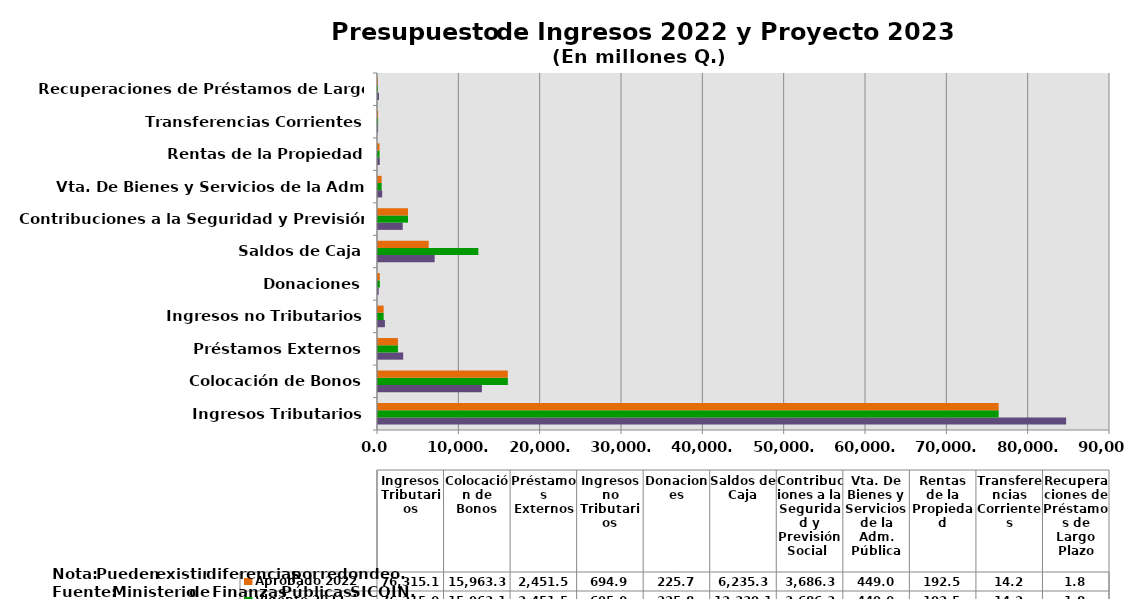
| Category | Recomendado 2023 | Vigente 2022 | Aprobado 2022 |
|---|---|---|---|
| Ingresos Tributarios | 84610.7 | 76315 | 76315.1 |
| Colocación de Bonos | 12775.1 | 15963.1 | 15963.3 |
| Préstamos Externos | 3096.7 | 2451.5 | 2451.5 |
| Ingresos no Tributarios | 850.6 | 695 | 694.9 |
| Donaciones | 83.9 | 225.8 | 225.7 |
| Saldos de Caja | 6965.9 | 12339.1 | 6235.3 |
| Contribuciones a la Seguridad y Previsión Social  | 3043.1 | 3686.3 | 3686.3 |
| Vta. De Bienes y Servicios de la Adm. Pública | 515.4 | 449 | 449 |
| Rentas de la Propiedad | 217.8 | 192.5 | 192.5 |
| Transferencias Corrientes | 13.4 | 14.2 | 14.2 |
| Recuperaciones de Préstamos de Largo Plazo | 122.2 | 1.8 | 1.8 |